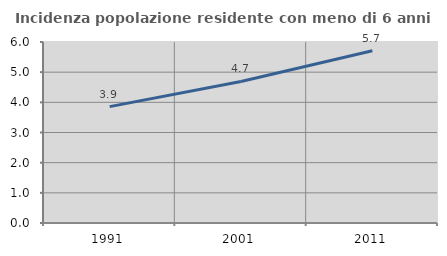
| Category | Incidenza popolazione residente con meno di 6 anni |
|---|---|
| 1991.0 | 3.858 |
| 2001.0 | 4.691 |
| 2011.0 | 5.708 |